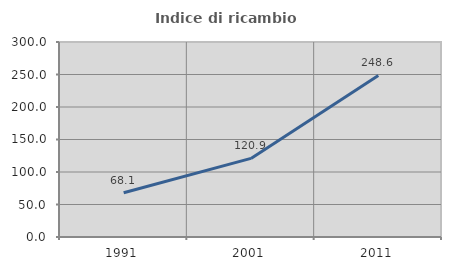
| Category | Indice di ricambio occupazionale  |
|---|---|
| 1991.0 | 68.065 |
| 2001.0 | 120.93 |
| 2011.0 | 248.56 |